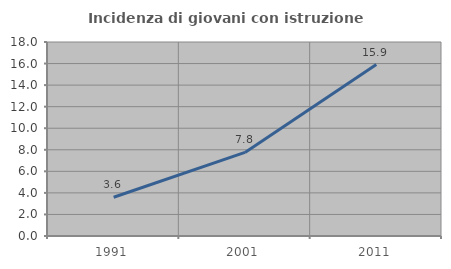
| Category | Incidenza di giovani con istruzione universitaria |
|---|---|
| 1991.0 | 3.593 |
| 2001.0 | 7.759 |
| 2011.0 | 15.909 |